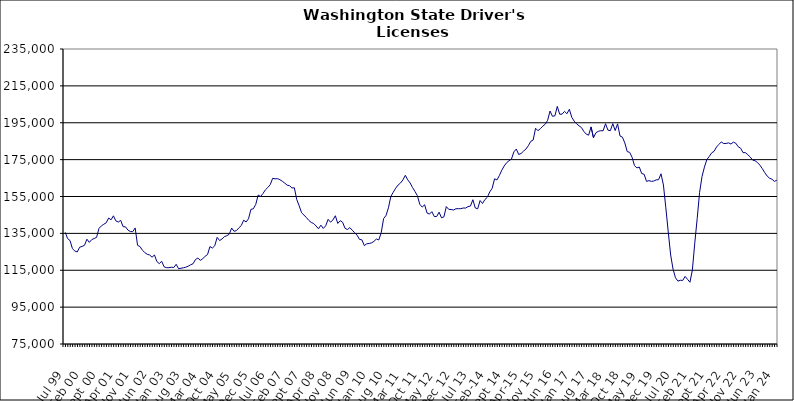
| Category | Series 0 |
|---|---|
| Jul 99 | 135560 |
| Aug 99 | 132182 |
| Sep 99 | 131104 |
| Oct 99 | 126694 |
| Nov 99 | 125425 |
| Dec 99 | 124927 |
| Jan 00 | 127499 |
| Feb 00 | 127927 |
| Mar 00 | 128547 |
| Apr 00 | 131834 |
| May 00 | 130120 |
| Jun 00 | 131595 |
| Jul 00 | 132236 |
| Aug 00 | 132819 |
| Sep 00 | 137711 |
| Oct 00 | 139063 |
| Nov 00 | 139952 |
| Dec 00 | 140732 |
| Jan 01 | 143338 |
| Feb 01 | 142359 |
| Mar 01 | 144523 |
| Apr 01 | 141758 |
| May 01 | 141135 |
| Jun 01 | 142064 |
| Jul 01 | 138646 |
| Aug 01 | 138530 |
| Sep 01 | 136784 |
| Oct 01 | 135996 |
| Nov 01 | 135917 |
| Dec 01 | 137940 |
| Jan 02 | 128531 |
| Feb 02 | 127848 |
| Mar 02 | 125876 |
| Apr 02 | 124595 |
| May 02 | 123660 |
| Jun 02 | 123282 |
| Jul 02 | 122089 |
| Aug 02 | 123279 |
| Sep 02 | 119727 |
| Oct 02 | 118588 |
| Nov 02 | 119854 |
| Dec 02 | 116851 |
| Jan 03 | 116407 |
| Feb 03 | 116382 |
| Mar 03 | 116648 |
| Apr 03 | 116471 |
| May 03 | 118231 |
| Jun 03 | 115831 |
| Jul 03 | 116082 |
| Aug 03 | 116341 |
| Sep 03 | 116653 |
| Oct 03 | 117212 |
| Nov 03 | 117962 |
| Dec 03 | 118542 |
| Jan 04 | 120817 |
| Feb 04 | 121617 |
| Mar 04 | 120369 |
| Apr 04 | 121200 |
| May 04 | 122609 |
| Jun 04 | 123484 |
| Jul 04 | 127844 |
| Aug 04 | 127025 |
| Sep 04 | 128273 |
| Oct 04 | 132853 |
| Nov 04 | 131106 |
| Dec 04 | 131935 |
| Jan 05 | 133205 |
| Feb 05 | 133736 |
| Mar 05 | 134528 |
| Apr 05 | 137889 |
| May 05 | 136130 |
| Jun 05 | 136523 |
| Jul 05 | 137997 |
| Aug 05 | 139294 |
| Sep 05 | 142140 |
| Oct 05 | 141192 |
| Nov 05 | 142937 |
| Dec 05 | 148013 |
| Jan 06 | 148341 |
| Feb 06 | 150744 |
| Mar 06 | 155794 |
| Apr 06 | 154984 |
| May 06 | 156651 |
| Jun 06 | 158638 |
| Jul 06 | 159911 |
| Aug 06 | 161445 |
| Sep 06 | 164852 |
| Oct 06 | 164570 |
| Nov 06 | 164679 |
| Dec 06 | 164127 |
| Jan 07 | 163271 |
| Feb 07 | 162273 |
| Mar 07 | 161140 |
| Apr 07 | 160860 |
| May 07 | 159633 |
| Jun 07 | 159724 |
| Jul 07 | 153303 |
| Aug 07 | 149939 |
| Sep 07 | 146172 |
| Oct 07 | 144876 |
| Nov 07 | 143613 |
| Dec 07 | 142022 |
| Jan 08 | 140909 |
| Feb 08 | 140368 |
| Mar 08 | 138998 |
| Apr 08 | 137471 |
| May 08 | 139453 |
| Jun 08 | 137680 |
| Jul 08 | 139120 |
| Aug 08 | 142612 |
| Sep-08 | 141071 |
| Oct 08 | 142313 |
| Nov 08 | 144556 |
| Dec 08 | 140394 |
| Jan 09 | 141903 |
| Feb 09 | 141036 |
| Mar 09 | 137751 |
| Apr 09 | 137060 |
| May 09 | 138101 |
| Jun 09 | 136739 |
| Jul 09 | 135317 |
| Aug 09 | 134020 |
| Sep 09 | 131756 |
| Oct 09 | 131488 |
| Nov 09 | 128370 |
| Dec 09 | 129323 |
| Jan 10 | 129531 |
| Feb 10 | 129848 |
| Mar 10 | 130654 |
| Apr 10 | 131929 |
| May 10 | 131429 |
| Jun 10 | 135357 |
| Jul 10 | 143032 |
| Aug 10 | 144686 |
| Sep 10 | 148856 |
| Oct 10 | 155042 |
| Nov 10 | 157328 |
| Dec 10 | 159501 |
| Jan 11 | 161221 |
| Feb 11 | 162312 |
| Mar 11 | 163996 |
| Apr 11 | 166495 |
| May 11 | 164040 |
| Jun 11 | 162324 |
| Jul 11 | 159862 |
| Aug 11 | 157738 |
| Sep 11 | 155430 |
| Oct 11 | 150762 |
| Nov 11 | 149255 |
| Dec 11 | 150533 |
| Jan 12 | 146068 |
| Feb 12 | 145446 |
| Mar 12 | 146788 |
| Apr 12 | 144110 |
| May 12 | 144162 |
| Jun 12 | 146482 |
| Jul 12 | 143445 |
| Aug 12 | 143950 |
| Sep 12 | 149520 |
| Oct 12 | 148033 |
| Nov 12 | 147926 |
| Dec 12 | 147674 |
| Jan 13 | 148360 |
| Feb-13 | 148388 |
| Mar-13 | 148414 |
| Apr 13 | 148749 |
| May 13 | 148735 |
| Jun-13 | 149521 |
| Jul 13 | 149837 |
| Aug 13 | 153252 |
| Sep 13 | 148803 |
| Oct 13 | 148315 |
| Nov 13 | 152804 |
| Dec 13 | 151209 |
| Jan 14 | 153357 |
| Feb-14 | 154608 |
| Mar 14 | 157479 |
| Apr 14 | 159441 |
| May 14 | 164591 |
| Jun 14 | 163995 |
| Jul-14 | 166411 |
| Aug-14 | 169272 |
| Sep 14 | 171565 |
| Oct 14 | 173335 |
| Nov 14 | 174406 |
| Dec 14 | 175302 |
| Jan 15 | 179204 |
| Feb 15 | 180737 |
| Mar 15 | 177810 |
| Apr-15 | 178331 |
| May 15 | 179601 |
| Jun-15 | 180729 |
| Jul 15 | 182540 |
| Aug 15 | 184924 |
| Sep 15 | 185620 |
| Oct 15 | 192002 |
| Nov 15 | 190681 |
| Dec 15 | 191795 |
| Jan 16 | 193132 |
| Feb 16 | 194206 |
| Mar 16 | 196319 |
| Apr 16 | 201373 |
| May 16 | 198500 |
| Jun 16 | 198743 |
| Jul 16 | 203841 |
| Aug 16 | 199630 |
| Sep 16 | 199655 |
| Oct 16 | 201181 |
| Nov 16 | 199888 |
| Dec 16 | 202304 |
| Jan 17 | 197977 |
| Feb 17 | 195889 |
| Mar 17 | 194438 |
| Apr 17 | 193335 |
| May 17 | 192430 |
| Jun 17 | 190298 |
| Jul 17 | 188832 |
| Aug 17 | 188264 |
| Sep 17 | 192738 |
| Oct 17 | 186856 |
| Nov 17 | 189537 |
| Dec 17 | 190341 |
| Jan 18 | 190670 |
| Feb 18 | 190645 |
| Mar 18 | 194476 |
| Apr 18 | 190971 |
| May 18 | 190707 |
| Jun 18 | 194516 |
| Jul 18 | 190783 |
| Aug 18 | 194390 |
| Sep 18 | 187831 |
| Oct 18 | 187188 |
| Nov 18 | 184054 |
| Dec 18 | 179347 |
| Jan 19 | 178958 |
| Feb 19 | 176289 |
| Mar 19 | 171747 |
| Apr 19 | 170532 |
| May 19 | 170967 |
| Jun 19 | 167444 |
| Jul 19 | 167059 |
| Aug 19 | 163194 |
| Sep 19 | 163599 |
| Oct 19 | 163212 |
| Nov 19 | 163388 |
| Dec 19 | 164024 |
| Jan 20 | 164114 |
| Feb 20 | 167320 |
| Mar 20 | 161221 |
| Apr 20 | 148866 |
| May 20 | 135821 |
| Jun 20 | 123252 |
| Jul 20 | 115526 |
| Aug 20 | 110940 |
| Sep 20 | 109099 |
| Oct 20 | 109566 |
| Nov 20 | 109488 |
| Dec 20 | 111658 |
| Jan 21 | 110070 |
| Feb 21 | 108491 |
| Mar 21 | 115176 |
| Apr 21 | 129726 |
| May 21 | 143052 |
| Jun 21 | 157253 |
| Jul 21 | 165832 |
| Aug 21 | 170937 |
| Sep 21 | 175042 |
| Oct 21 | 176696 |
| Nov 21 | 178677 |
| Dec 21 | 179501 |
| Jan 22 | 181825 |
| Feb 22 | 183258 |
| Mar 22 | 184618 |
| Apr 22 | 183710 |
| May 22 | 183784 |
| Jun 22 | 184101 |
| Jul 22 | 183443 |
| Aug 22 | 184475 |
| Sep 22 | 183902 |
| Oct 22 | 181994 |
| Nov 22 | 181207 |
| Dec 22 | 178793 |
| Jan 23 | 178782 |
| Feb 23 | 177647 |
| Mar 23 | 176386 |
| Apr 23 | 174729 |
| May 23 | 174390 |
| Jun 23 | 173391 |
| Jul 23 | 171988 |
| Aug 23 | 170100 |
| Sep 23 | 167953 |
| Oct 23 | 166088 |
| Nov 23 | 164934 |
| Dec 23 | 164371 |
| Jan 24 | 163182 |
| Feb 24 | 163845 |